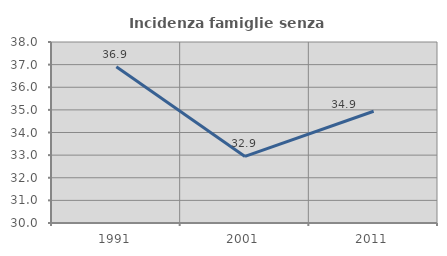
| Category | Incidenza famiglie senza nuclei |
|---|---|
| 1991.0 | 36.905 |
| 2001.0 | 32.941 |
| 2011.0 | 34.94 |